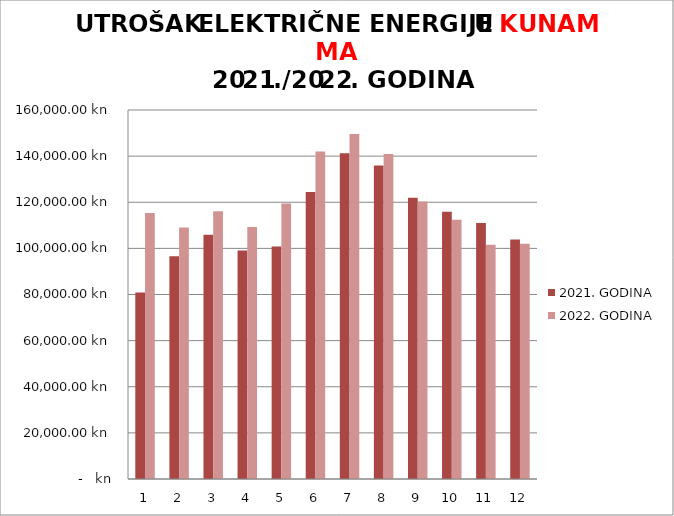
| Category | 2021. GODINA | 2022. GODINA |
|---|---|---|
| 0 | 80815.97 | 115310.5 |
| 1 | 96548.61 | 109075.91 |
| 2 | 105896.77 | 116148.25 |
| 3 | 99025.52 | 109303.8 |
| 4 | 100807.03 | 119444.45 |
| 5 | 124448.45 | 142017.06 |
| 6 | 141199.24 | 149595.62 |
| 7 | 135953.31 | 140955.63 |
| 8 | 121955.08 | 120303.54 |
| 9 | 115892.32 | 112414.92 |
| 10 | 111043.11 | 101535.23 |
| 11 | 103846.04 | 101959.87 |